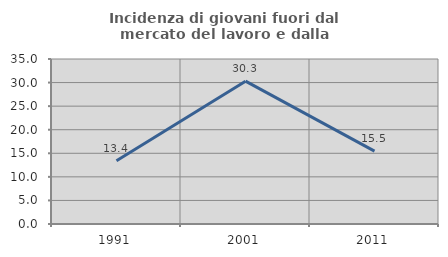
| Category | Incidenza di giovani fuori dal mercato del lavoro e dalla formazione  |
|---|---|
| 1991.0 | 13.418 |
| 2001.0 | 30.294 |
| 2011.0 | 15.457 |